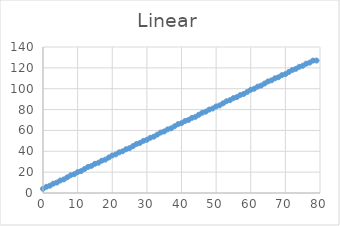
| Category | Series 0 |
|---|---|
| 0.0 | 4 |
| 1.0 | 6 |
| 2.0 | 7 |
| 3.0 | 9 |
| 4.0 | 10 |
| 5.0 | 12 |
| 6.0 | 13 |
| 7.0 | 15 |
| 8.0 | 17 |
| 9.0 | 18 |
| 10.0 | 20 |
| 11.0 | 21 |
| 12.0 | 23 |
| 13.0 | 25 |
| 14.0 | 26 |
| 15.0 | 28 |
| 16.0 | 29 |
| 17.0 | 31 |
| 18.0 | 32 |
| 19.0 | 34 |
| 20.0 | 36 |
| 21.0 | 37 |
| 22.0 | 39 |
| 23.0 | 40 |
| 24.0 | 42 |
| 25.0 | 43 |
| 26.0 | 45 |
| 27.0 | 47 |
| 28.0 | 48 |
| 29.0 | 50 |
| 30.0 | 51 |
| 31.0 | 53 |
| 32.0 | 54 |
| 33.0 | 56 |
| 34.0 | 58 |
| 35.0 | 59 |
| 36.0 | 61 |
| 37.0 | 62 |
| 38.0 | 64 |
| 39.0 | 66 |
| 40.0 | 67 |
| 41.0 | 69 |
| 42.0 | 70 |
| 43.0 | 72 |
| 44.0 | 73 |
| 45.0 | 75 |
| 46.0 | 77 |
| 47.0 | 78 |
| 48.0 | 80 |
| 49.0 | 81 |
| 50.0 | 83 |
| 51.0 | 84 |
| 52.0 | 86 |
| 53.0 | 88 |
| 54.0 | 89 |
| 55.0 | 91 |
| 56.0 | 92 |
| 57.0 | 94 |
| 58.0 | 95 |
| 59.0 | 97 |
| 60.0 | 99 |
| 61.0 | 100 |
| 62.0 | 102 |
| 63.0 | 103 |
| 64.0 | 105 |
| 65.0 | 107 |
| 66.0 | 108 |
| 67.0 | 110 |
| 68.0 | 111 |
| 69.0 | 113 |
| 70.0 | 114 |
| 71.0 | 116 |
| 72.0 | 118 |
| 73.0 | 119 |
| 74.0 | 121 |
| 75.0 | 122 |
| 76.0 | 124 |
| 77.0 | 125 |
| 78.0 | 127 |
| 79.0 | 127 |